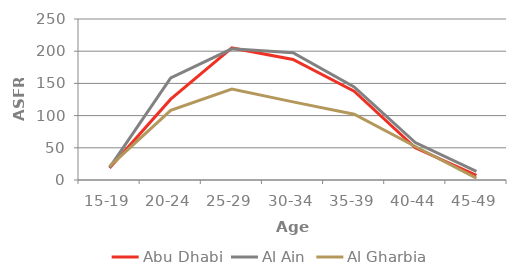
| Category | Abu Dhabi | Al Ain | Al Gharbia |
|---|---|---|---|
| 15-19 | 18.645 | 19.322 | 21.277 |
| 20-24 | 125.546 | 158.628 | 108.26 |
| 25-29 | 205.085 | 203.707 | 141.215 |
| 30-34 | 187.083 | 197.529 | 121.315 |
| 35-39 | 137.996 | 144.499 | 102.073 |
| 40-44 | 49.946 | 58.167 | 52.009 |
| 45-49 | 7.33 | 13.485 | 2.801 |